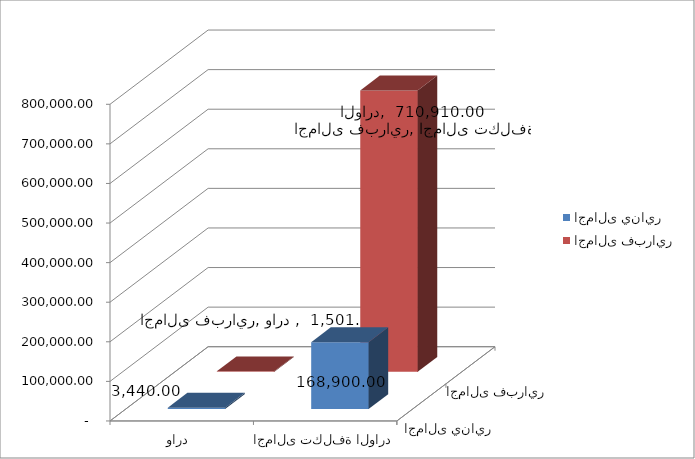
| Category | اجمالى يناير | اجمالى فبراير |
|---|---|---|
| وارد  | 3440 | 1501 |
| اجمالى تكلفة الوارد | 168900 | 710910 |